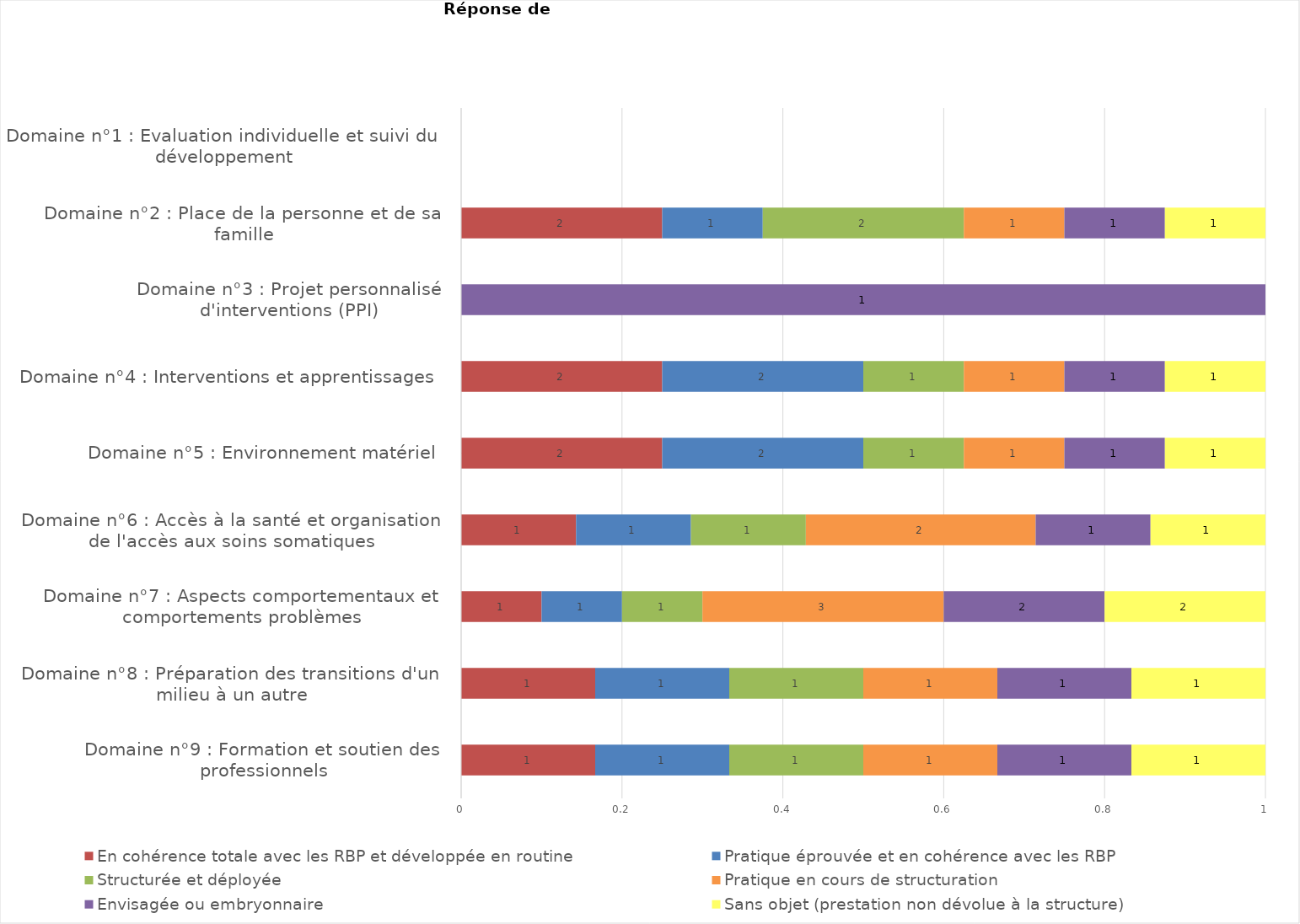
| Category | En cohérence totale avec les RBP et développée en routine | Pratique éprouvée et en cohérence avec les RBP | Structurée et déployée | Pratique en cours de structuration | Envisagée ou embryonnaire | Sans objet (prestation non dévolue à la structure) |
|---|---|---|---|---|---|---|
| Domaine n°9 : Formation et soutien des professionnels | 1 | 1 | 1 | 1 | 1 | 1 |
| Domaine n°8 : Préparation des transitions d'un milieu à un autre | 1 | 1 | 1 | 1 | 1 | 1 |
| Domaine n°7 : Aspects comportementaux et comportements problèmes | 1 | 1 | 1 | 3 | 2 | 2 |
| Domaine n°6 : Accès à la santé et organisation de l'accès aux soins somatiques | 1 | 1 | 1 | 2 | 1 | 1 |
| Domaine n°5 : Environnement matériel | 2 | 2 | 1 | 1 | 1 | 1 |
| Domaine n°4 : Interventions et apprentissages | 2 | 2 | 1 | 1 | 1 | 1 |
| Domaine n°3 : Projet personnalisé d'interventions (PPI) | 0 | 0 | 0 | 0 | 1 | 0 |
| Domaine n°2 : Place de la personne et de sa famille | 2 | 1 | 2 | 1 | 1 | 1 |
| Domaine n°1 : Evaluation individuelle et suivi du développement | 0 | 0 | 0 | 0 | 0 | 0 |